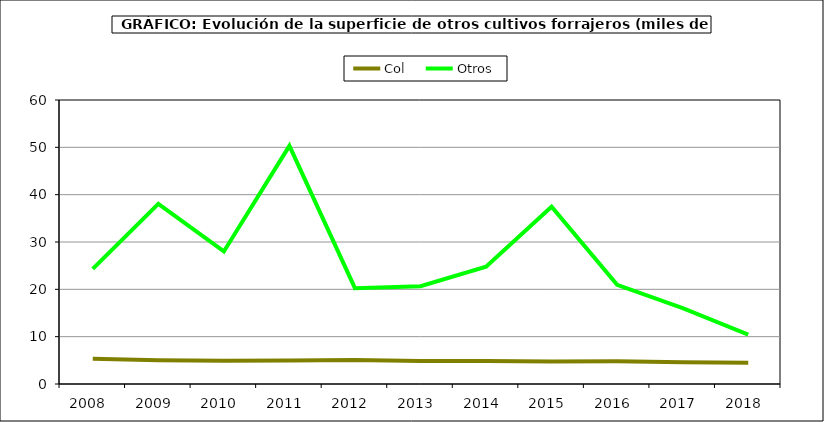
| Category | Col | Otros |
|---|---|---|
| 2008.0 | 5.333 | 24.321 |
| 2009.0 | 4.996 | 38.075 |
| 2010.0 | 4.899 | 27.997 |
| 2011.0 | 4.982 | 50.317 |
| 2012.0 | 5.09 | 20.245 |
| 2013.0 | 4.865 | 20.659 |
| 2014.0 | 4.875 | 24.797 |
| 2015.0 | 4.771 | 37.464 |
| 2016.0 | 4.781 | 20.965 |
| 2017.0 | 4.601 | 16.007 |
| 2018.0 | 4.492 | 10.42 |